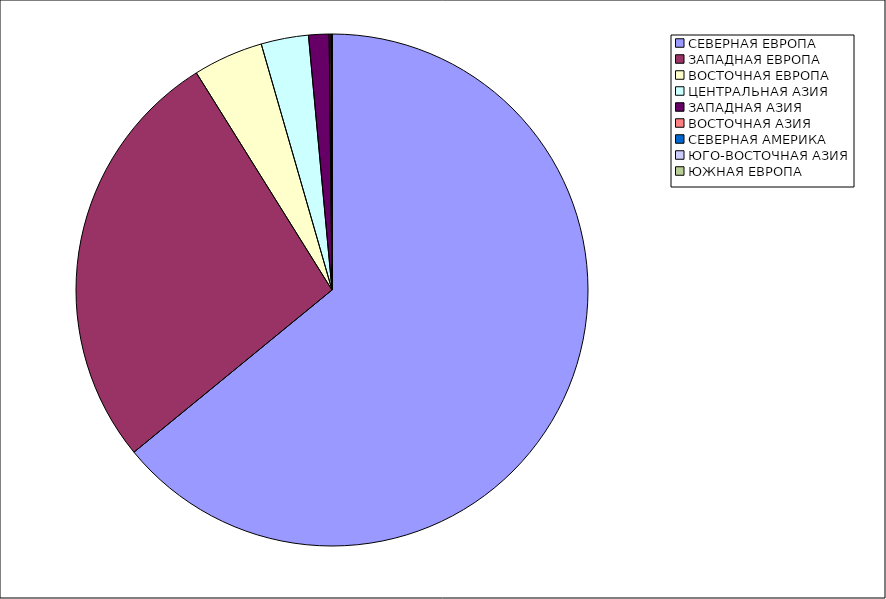
| Category | Оборот |
|---|---|
| СЕВЕРНАЯ ЕВРОПА | 64.078 |
| ЗАПАДНАЯ ЕВРОПА | 27.036 |
| ВОСТОЧНАЯ ЕВРОПА | 4.427 |
| ЦЕНТРАЛЬНАЯ АЗИЯ | 2.991 |
| ЗАПАДНАЯ АЗИЯ | 1.29 |
| ВОСТОЧНАЯ АЗИЯ | 0.102 |
| СЕВЕРНАЯ АМЕРИКА | 0.076 |
| ЮГО-ВОСТОЧНАЯ АЗИЯ | 0 |
| ЮЖНАЯ ЕВРОПА | 0 |